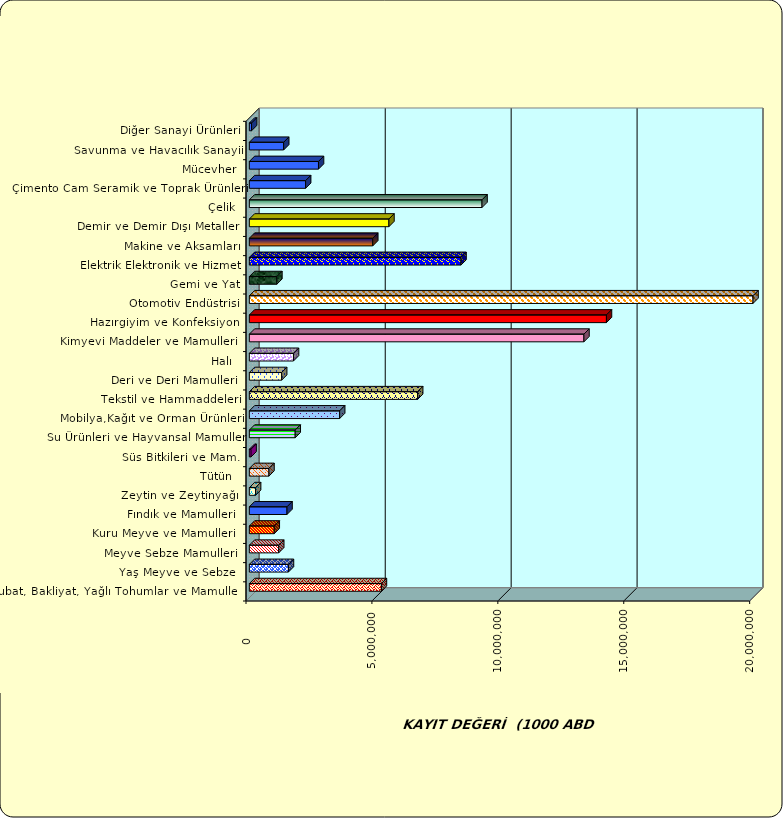
| Category | Series 0 |
|---|---|
|  Hububat, Bakliyat, Yağlı Tohumlar ve Mamulleri  | 5243611.303 |
|  Yaş Meyve ve Sebze   | 1551561.256 |
|  Meyve Sebze Mamulleri  | 1165010.382 |
|  Kuru Meyve ve Mamulleri   | 988144.353 |
|  Fındık ve Mamulleri  | 1495148.769 |
|  Zeytin ve Zeytinyağı  | 246835.811 |
|  Tütün  | 778040.653 |
|  Süs Bitkileri ve Mam. | 67587.779 |
|  Su Ürünleri ve Hayvansal Mamuller | 1821130.067 |
|  Mobilya,Kağıt ve Orman Ürünleri | 3585450.672 |
|  Tekstil ve Hammaddeleri | 6682344.764 |
|  Deri ve Deri Mamulleri  | 1281808.831 |
|  Halı  | 1752825.896 |
|  Kimyevi Maddeler ve Mamulleri   | 13285402.065 |
|  Hazırgiyim ve Konfeksiyon  | 14179700.51 |
|  Otomotiv Endüstrisi | 23401296.472 |
|  Gemi ve Yat | 1091567.612 |
|  Elektrik Elektronik ve Hizmet | 8404173.667 |
|  Makine ve Aksamları | 4900188.857 |
|  Demir ve Demir Dışı Metaller  | 5541925.707 |
|  Çelik | 9238880.321 |
|  Çimento Cam Seramik ve Toprak Ürünleri | 2233764.51 |
|  Mücevher | 2745467.699 |
|  Savunma ve Havacılık Sanayii | 1363158.852 |
|  Diğer Sanayi Ürünleri | 87150.15 |